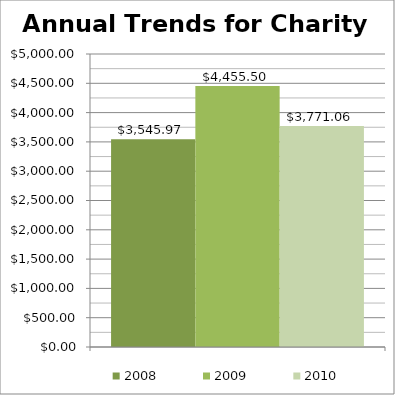
| Category | 2008 | 2009 | 2010 |
|---|---|---|---|
| 0 | 3545.97 | 4455.5 | 3771.06 |